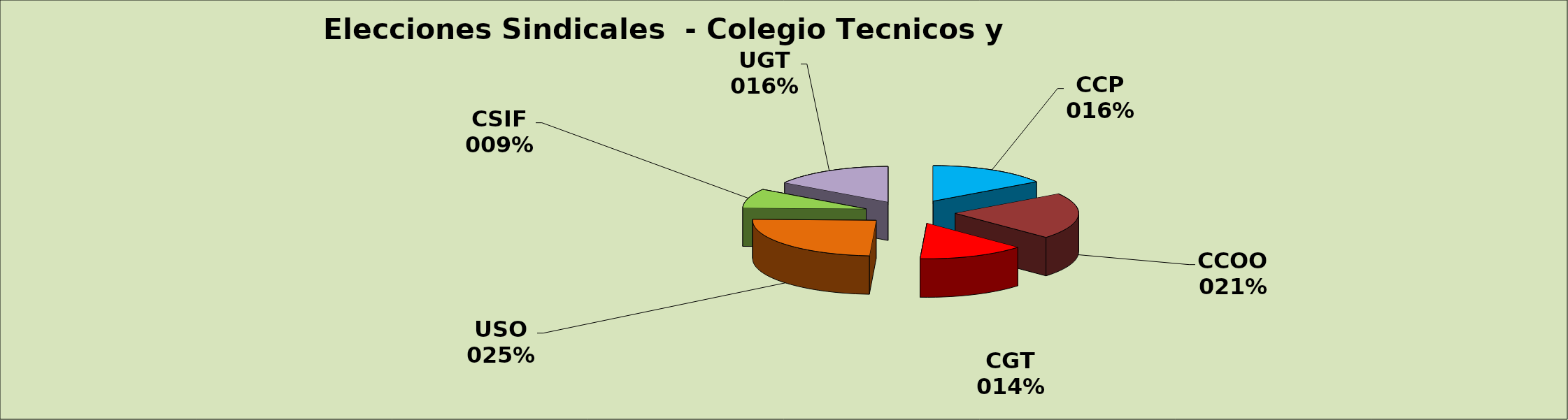
| Category | TECNICOS Y ADMINISTRATIVOS |
|---|---|
| CCP | 90 |
| CCOO | 120 |
| CGT | 80 |
| USO | 140 |
| CSIF | 50 |
| UGT | 90 |